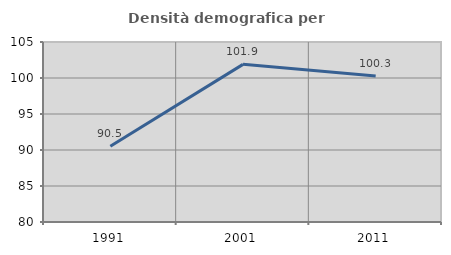
| Category | Densità demografica |
|---|---|
| 1991.0 | 90.51 |
| 2001.0 | 101.894 |
| 2011.0 | 100.29 |